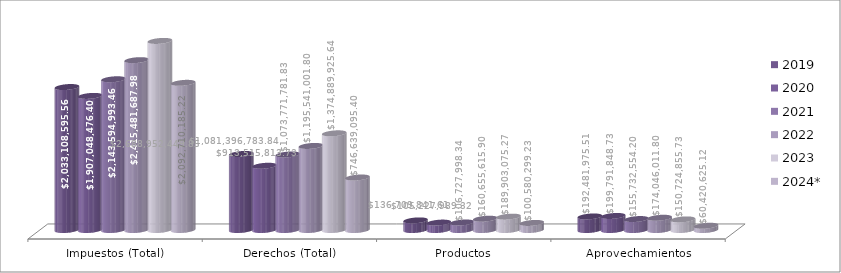
| Category | 2019 | 2020 | 2021 | 2022 | 2023 | 2024* |
|---|---|---|---|---|---|---|
| Impuestos (Total) | 2033108595.56 | 1907048476.4 | 2143594993.46 | 2415481687.98 | 2688952449.85 | 2092710185.22 |
| Derechos (Total) | 1081396783.84 | 913515813.73 | 1073771781.83 | 1195541001.8 | 1374889925.64 | 746639095.4 |
| Productos | 136709841.61 | 105227989.32 | 106727998.34 | 160655615.9 | 189903075.27 | 100580299.23 |
| Aprovechamientos | 192481975.51 | 199791848.73 | 155732554.2 | 174046011.8 | 150724855.73 | 60420625.12 |